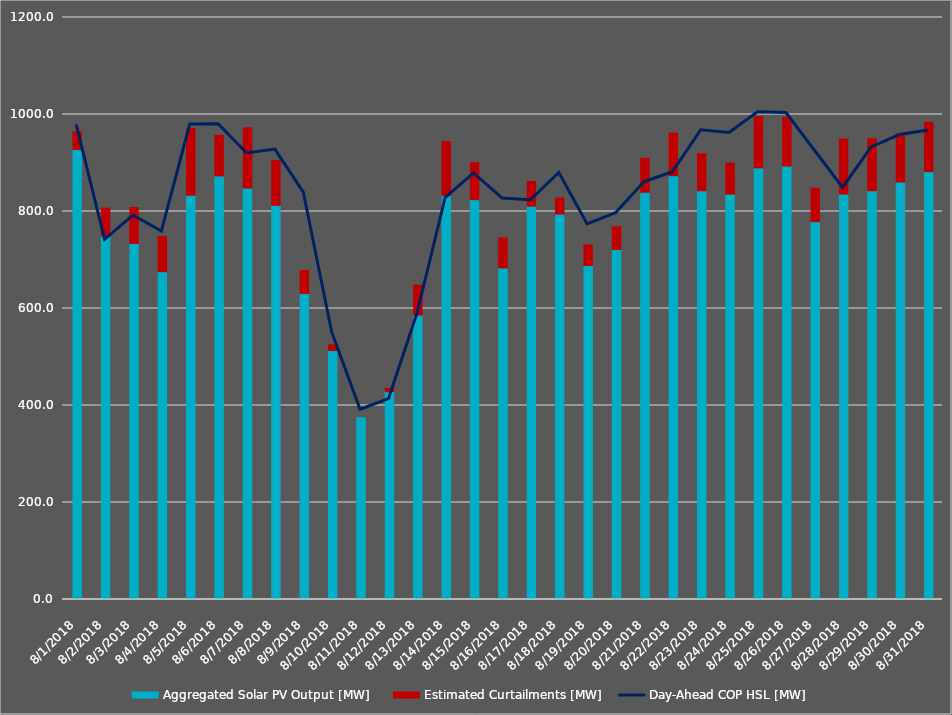
| Category | Aggregated Solar PV Output [MW]   | Estimated Curtailments [MW] |
|---|---|---|
| 8/1/18 | 927.767 | 36.78 |
| 8/2/18 | 749.636 | 57.369 |
| 8/3/18 | 734.19 | 74.072 |
| 8/4/18 | 675.809 | 72.892 |
| 8/5/18 | 833.538 | 137.832 |
| 8/6/18 | 873.315 | 83.631 |
| 8/7/18 | 848.498 | 124.019 |
| 8/8/18 | 812.654 | 92.19 |
| 8/9/18 | 630.822 | 47.79 |
| 8/10/18 | 513.538 | 11.753 |
| 8/11/18 | 374.838 | 0 |
| 8/12/18 | 428.675 | 6.737 |
| 8/13/18 | 586.618 | 61.631 |
| 8/14/18 | 832.788 | 111.752 |
| 8/15/18 | 824.505 | 76.219 |
| 8/16/18 | 683.694 | 61.806 |
| 8/17/18 | 810.941 | 50.904 |
| 8/18/18 | 794.717 | 33.075 |
| 8/19/18 | 688.796 | 42.12 |
| 8/20/18 | 721.729 | 46.755 |
| 8/21/18 | 839.707 | 69.982 |
| 8/22/18 | 873.809 | 88.047 |
| 8/23/18 | 842.79 | 76.221 |
| 8/24/18 | 835.85 | 63.939 |
| 8/25/18 | 889.928 | 105.511 |
| 8/26/18 | 893.835 | 100.39 |
| 8/27/18 | 779.029 | 69.095 |
| 8/28/18 | 836.009 | 113.285 |
| 8/29/18 | 842.854 | 107.083 |
| 8/30/18 | 860.8 | 99.914 |
| 8/31/18 | 882.129 | 101.762 |